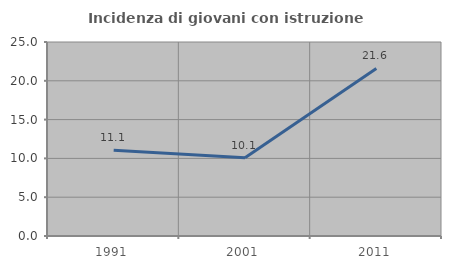
| Category | Incidenza di giovani con istruzione universitaria |
|---|---|
| 1991.0 | 11.055 |
| 2001.0 | 10.081 |
| 2011.0 | 21.591 |